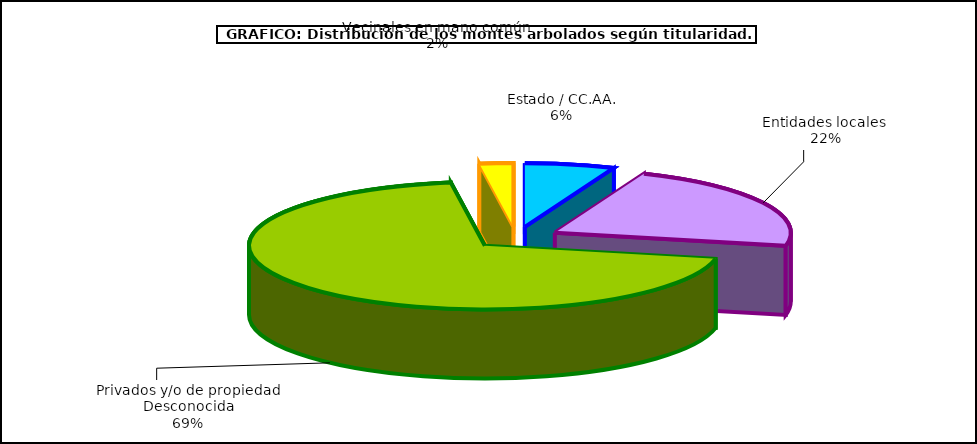
| Category | Series 0 |
|---|---|
| Estado / CC.AA. | 1143690.245 |
| Entidades locales  | 4114507.179 |
| Privados y/o de propiedad Desconocida | 12891109.739 |
| Vecinales en mano común  | 428471.925 |